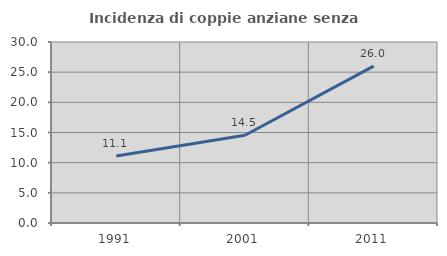
| Category | Incidenza di coppie anziane senza figli  |
|---|---|
| 1991.0 | 11.111 |
| 2001.0 | 14.545 |
| 2011.0 | 26 |